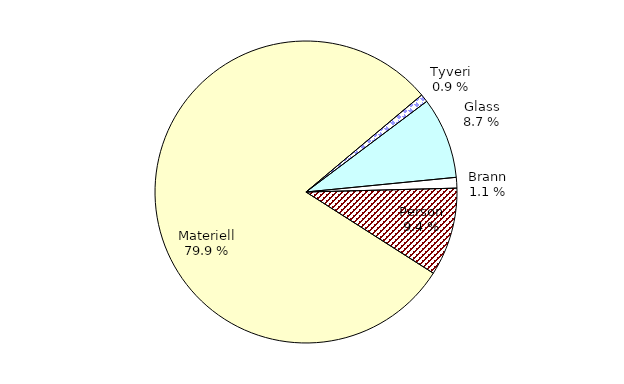
| Category | Series 0 |
|---|---|
| Tyveri | 47.477 |
| Glass | 478.462 |
| Brann | 63.001 |
| Person | 519.778 |
| Materiell | 4394.148 |